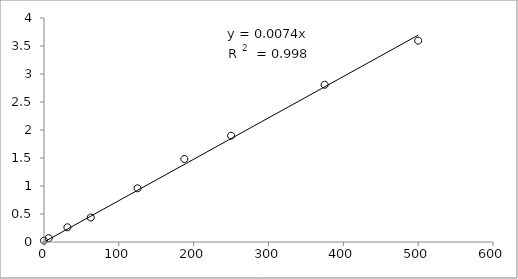
| Category | Series 0 |
|---|---|
| 500.0 | 3.595 |
| 375.0 | 2.808 |
| 250.0 | 1.898 |
| 187.5 | 1.483 |
| 125.0 | 0.959 |
| 62.5 | 0.438 |
| 31.25 | 0.262 |
| 6.25 | 0.068 |
| 0.0 | 0.024 |